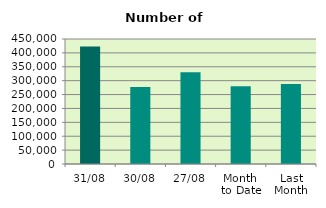
| Category | Series 0 |
|---|---|
| 31/08 | 422714 |
| 30/08 | 277544 |
| 27/08 | 330080 |
| Month 
to Date | 279794.182 |
| Last
Month | 287917.636 |